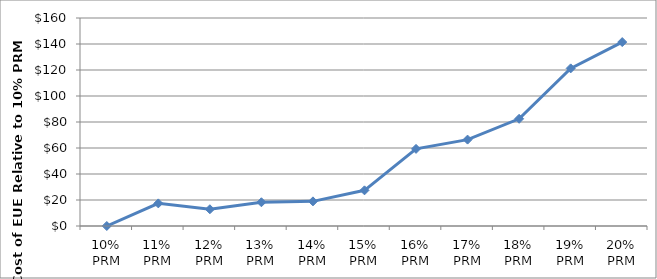
| Category | Data |
|---|---|
| 10% PRM | 0 |
| 11% PRM | 17.397 |
| 12% PRM | 12.878 |
| 13% PRM | 18.26 |
| 14% PRM | 18.946 |
| 15% PRM | 27.435 |
| 16% PRM | 59.317 |
| 17% PRM | 66.459 |
| 18% PRM | 82.461 |
| 19% PRM | 121.238 |
| 20% PRM | 141.486 |